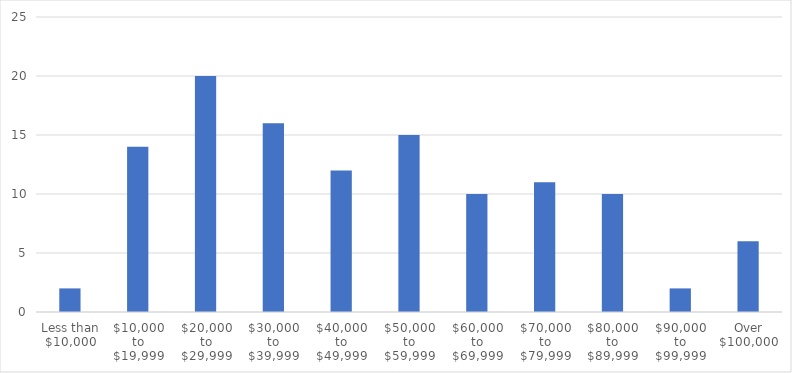
| Category | Number of Responses |
|---|---|
| Less than $10,000 | 2 |
| $10,000 to $19,999 | 14 |
| $20,000 to $29,999 | 20 |
| $30,000 to $39,999 | 16 |
| $40,000 to $49,999 | 12 |
| $50,000 to $59,999 | 15 |
| $60,000 to $69,999 | 10 |
| $70,000 to $79,999 | 11 |
| $80,000 to $89,999 | 10 |
| $90,000 to $99,999 | 2 |
| Over $100,000 | 6 |